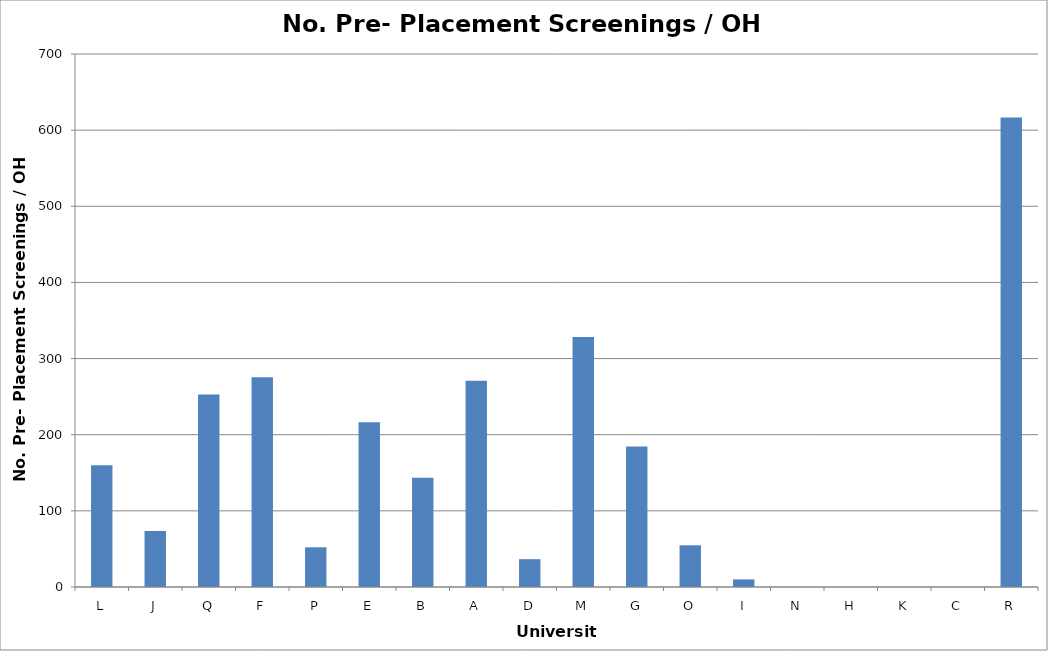
| Category | No. Pre- Placement Screenings / OH FTE |
|---|---|
| L | 159.744 |
| J | 73.556 |
| Q | 252.778 |
| F | 275.349 |
| P | 52.143 |
| E | 216.25 |
| B | 143.488 |
| A | 270.87 |
| D | 36.527 |
| M | 328.421 |
| G | 184.397 |
| O | 54.762 |
| I | 10 |
| N | 0 |
| H | 0 |
| K | 0 |
| C | 0 |
| R | 616.471 |